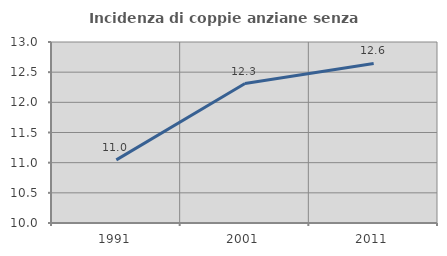
| Category | Incidenza di coppie anziane senza figli  |
|---|---|
| 1991.0 | 11.047 |
| 2001.0 | 12.312 |
| 2011.0 | 12.644 |